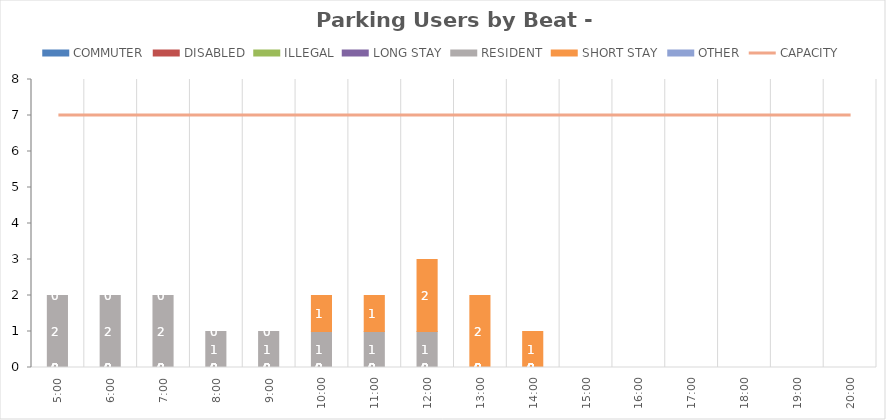
| Category | COMMUTER | DISABLED | ILLEGAL | LONG STAY | RESIDENT | SHORT STAY | OTHER |
|---|---|---|---|---|---|---|---|
| 0.20833333333333334 | 0 | 0 | 0 | 0 | 2 | 0 | 0 |
| 0.25 | 0 | 0 | 0 | 0 | 2 | 0 | 0 |
| 0.2916666666666667 | 0 | 0 | 0 | 0 | 2 | 0 | 0 |
| 0.3333333333333333 | 0 | 0 | 0 | 0 | 1 | 0 | 0 |
| 0.375 | 0 | 0 | 0 | 0 | 1 | 0 | 0 |
| 0.4166666666666667 | 0 | 0 | 0 | 0 | 1 | 1 | 0 |
| 0.4583333333333333 | 0 | 0 | 0 | 0 | 1 | 1 | 0 |
| 0.5 | 0 | 0 | 0 | 0 | 1 | 2 | 0 |
| 0.5416666666666666 | 0 | 0 | 0 | 0 | 0 | 2 | 0 |
| 0.5833333333333334 | 0 | 0 | 0 | 0 | 0 | 1 | 0 |
| 0.625 | 0 | 0 | 0 | 0 | 0 | 0 | 0 |
| 0.6666666666666666 | 0 | 0 | 0 | 0 | 0 | 0 | 0 |
| 0.7083333333333334 | 0 | 0 | 0 | 0 | 0 | 0 | 0 |
| 0.75 | 0 | 0 | 0 | 0 | 0 | 0 | 0 |
| 0.7916666666666666 | 0 | 0 | 0 | 0 | 0 | 0 | 0 |
| 0.8333333333333334 | 0 | 0 | 0 | 0 | 0 | 0 | 0 |